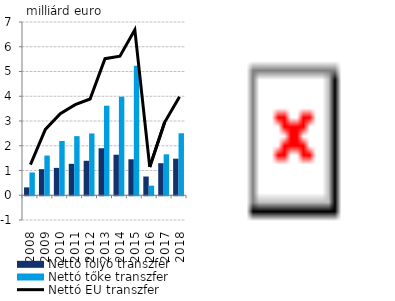
| Category | Nettó folyó transzfer | Nettó tőke transzfer |
|---|---|---|
| 2008.0 | 0.318 | 0.921 |
| 2009.0 | 1.056 | 1.603 |
| 2010.0 | 1.106 | 2.193 |
| 2011.0 | 1.271 | 2.388 |
| 2012.0 | 1.393 | 2.497 |
| 2013.0 | 1.899 | 3.619 |
| 2014.0 | 1.637 | 3.983 |
| 2015.0 | 1.453 | 5.237 |
| 2016.0 | 0.757 | 0.387 |
| 2017.0 | 1.294 | 1.654 |
| 2018.0 | 1.478 | 2.505 |